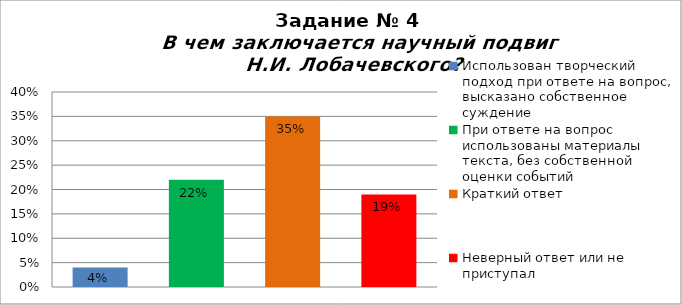
| Category | В чем заключается научный подвиг Н.И. Лобачевского? |
|---|---|
| Использован творческий подход при ответе на вопрос, высказано собственное суждение | 0.04 |
| При ответе на вопрос использованы материалы текста, без собственной оценки событий | 0.22 |
| Краткий ответ | 0.35 |
| Неверный ответ или не приступал | 0.19 |